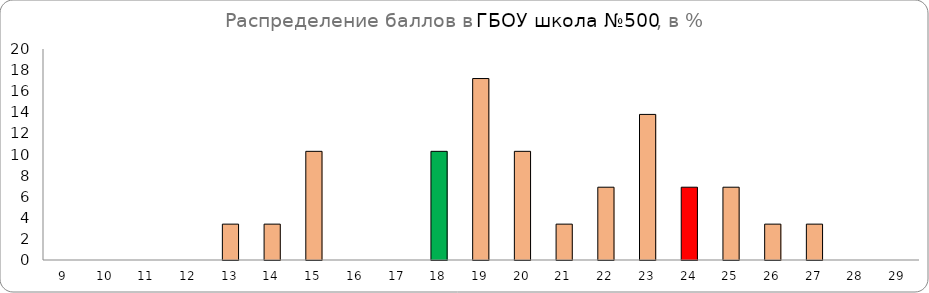
| Category | Series 0 |
|---|---|
| 9.0 | 0 |
| 10.0 | 0 |
| 11.0 | 0 |
| 12.0 | 0 |
| 13.0 | 3.4 |
| 14.0 | 3.4 |
| 15.0 | 10.3 |
| 16.0 | 0 |
| 17.0 | 0 |
| 18.0 | 10.3 |
| 19.0 | 17.2 |
| 20.0 | 10.3 |
| 21.0 | 3.4 |
| 22.0 | 6.9 |
| 23.0 | 13.8 |
| 24.0 | 6.9 |
| 25.0 | 6.9 |
| 26.0 | 3.4 |
| 27.0 | 3.4 |
| 28.0 | 0 |
| 29.0 | 0 |